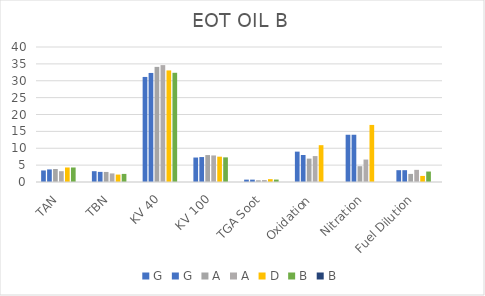
| Category | G | A | D | B |
|---|---|---|---|---|
| TAN | 3.73 | 3.2 | 4.3 |  |
| TBN | 3 | 2.54 | 2.2 |  |
| KV 40 | 32.31 | 34.63 | 33.06 |  |
| KV 100 | 7.39 | 7.87 | 7.505 |  |
| TGA Soot | 0.7 | 0.572 | 0.843 |  |
| Oxidation | 8 | 7.68 | 10.91 |  |
| Nitration | 14 | 6.65 | 16.91 |  |
| Fuel Dilution | 3.5 | 3.6 | 1.8 |  |